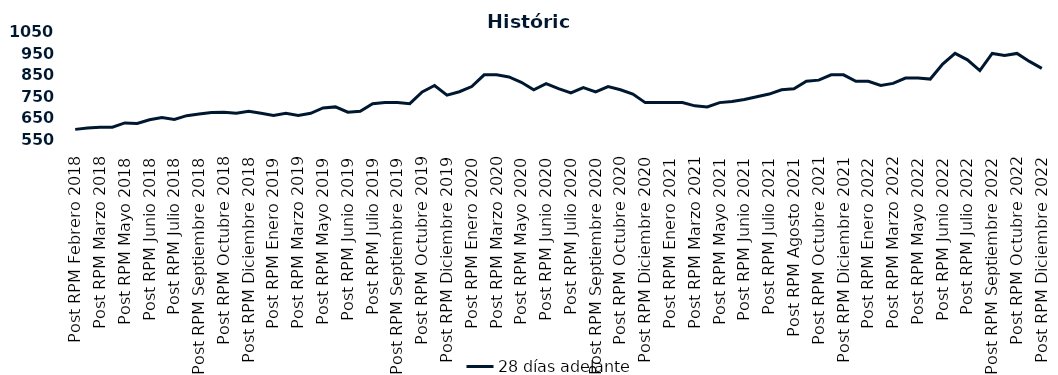
| Category | 28 días adelante |
|---|---|
| Post RPM Febrero 2018 | 595 |
| Pre RPM Marzo 2018 | 601 |
| Post RPM Marzo 2018 | 605 |
| Pre RPM Mayo 2018 | 605 |
| Post RPM Mayo 2018 | 625 |
| Pre RPM Junio 2018 | 623 |
| Post RPM Junio 2018 | 640 |
| Pre RPM Julio 2018 | 650 |
| Post RPM Julio 2018 | 641 |
| Pre RPM Septiembre 2018 | 659 |
| Post RPM Septiembre 2018 | 666.75 |
| Pre RPM Octubre 2018 | 674 |
| Post RPM Octubre 2018 | 675 |
| Pre RPM Diciembre 2018 | 670 |
| Post RPM Diciembre 2018 | 680 |
| Pre RPM Enero 2019 | 670 |
| Post RPM Enero 2019 | 660 |
| Pre RPM Marzo 2019 | 670 |
| Post RPM Marzo 2019 | 660 |
| Pre RPM Mayo 2019 | 670 |
| Post RPM Mayo 2019 | 695 |
| Pre RPM Junio 2019 | 700 |
| Post RPM Junio 2019 | 675 |
| Pre RPM Julio 2019 | 680 |
| Post RPM Julio 2019 | 715 |
| Pre RPM Septiembre 2019 | 720 |
| Post RPM Septiembre 2019 | 720 |
| Pre RPM Octubre 2019 | 715 |
| Post RPM Octubre 2019 | 770 |
| Pre RPM Diciembre 2019 | 800 |
| Post RPM Diciembre 2019 | 755 |
| Pre RPM Enero 2020 | 771 |
| Post RPM Enero 2020 | 795 |
| Pre RPM Marzo 2020 | 850 |
| Post RPM Marzo 2020 | 850 |
| Pre RPM Mayo 2020 | 840 |
| Post RPM Mayo 2020 | 815 |
| Pre RPM Junio 2020 | 780 |
| Post RPM Junio 2020 | 809 |
| Pre RPM Julio 2020 | 785.72 |
| Post RPM Julio 2020 | 765 |
| Pre RPM Septiembre 2020 | 790 |
| Post RPM Septiembre 2020 | 770 |
| Pre RPM Octubre 2020 | 795 |
| Post RPM Octubre 2020 | 780 |
| Pre RPM Diciembre 2020 | 760 |
| Post RPM Diciembre 2020 | 720 |
| Pre RPM Enero 2021 | 720 |
| Post RPM Enero 2021 | 720 |
| Pre RPM Marzo 2021 | 720 |
| Post RPM Marzo 2021 | 705 |
| Pre RPM Mayo 2021 | 700 |
| Post RPM Mayo 2021 | 720 |
| Pre RPM Junio 2021 | 725 |
| Post RPM Junio 2021 | 735 |
| Pre RPM Julio 2021 | 747.5 |
| Post RPM Julio 2021 | 760 |
| Pre RPM Agosto 2021 | 780 |
| Post RPM Agosto 2021 | 785 |
| Pre RPM Octubre 2021 | 820 |
| Post RPM Octubre 2021 | 825 |
| Pre RPM Diciembre 2021 | 850 |
| Post RPM Diciembre 2021 | 850 |
| Pre RPM Enero 2022 | 820 |
| Post RPM Enero 2022 | 820 |
| Pre RPM Marzo 2022 | 800 |
| Post RPM Marzo 2022 | 810 |
| Pre RPM Mayo 2022 | 835 |
| Post RPM Mayo 2022 | 835 |
| Pre RPM Junio 2022 | 830 |
| Post RPM Junio 2022 | 900 |
| Pre RPM Julio 2022 | 950 |
| Post RPM Julio 2022 | 920 |
| Pre RPM Septiembre 2022 | 870 |
| Post RPM Septiembre 2022 | 950 |
| Pre RPM Octubre 2022 | 940 |
| Post RPM Octubre 2022 | 950 |
| Pre RPM Diciembre 2022 | 912.5 |
| Post RPM Diciembre 2022 | 880 |